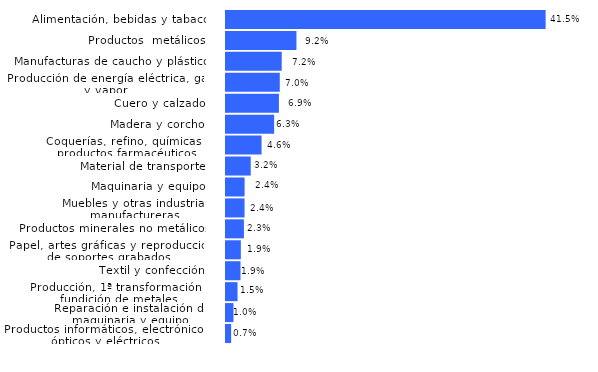
| Category | Año 2021 |
|---|---|
| Productos informáticos, electrónicos, ópticos y eléctricos | 0.007 |
| Reparación e instalación de maquinaria y equipo | 0.01 |
| Producción, 1ª transformación y fundición de metales | 0.015 |
| Textil y confección | 0.019 |
| Papel, artes gráficas y reproducción de soportes grabados | 0.019 |
| Productos minerales no metálicos | 0.023 |
| Muebles y otras industrias manufactureras | 0.024 |
| Maquinaria y equipo | 0.024 |
| Material de transporte | 0.032 |
| Coquerías, refino, químicas y productos farmacéuticos | 0.046 |
| Madera y corcho | 0.063 |
| Cuero y calzado | 0.069 |
| Producción de energía eléctrica, gas y vapor | 0.07 |
| Manufacturas de caucho y plástico | 0.072 |
| Productos  metálicos | 0.092 |
| Alimentación, bebidas y tabaco | 0.415 |